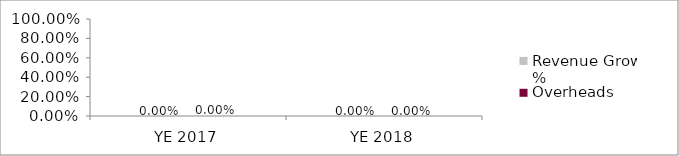
| Category | Revenue Growth % | Overheads Growth % |
|---|---|---|
| YE 2017 | 0 | 0 |
| YE 2018 | 0 | 0 |